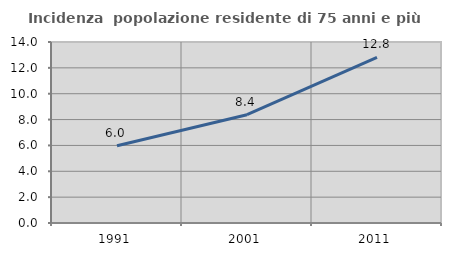
| Category | Incidenza  popolazione residente di 75 anni e più |
|---|---|
| 1991.0 | 5.977 |
| 2001.0 | 8.373 |
| 2011.0 | 12.819 |